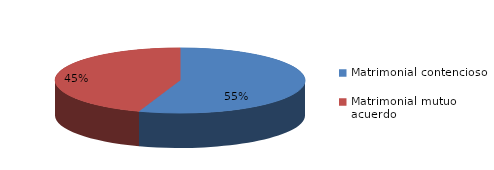
| Category | Series 0 |
|---|---|
| 0 | 120 |
| 1 | 97 |